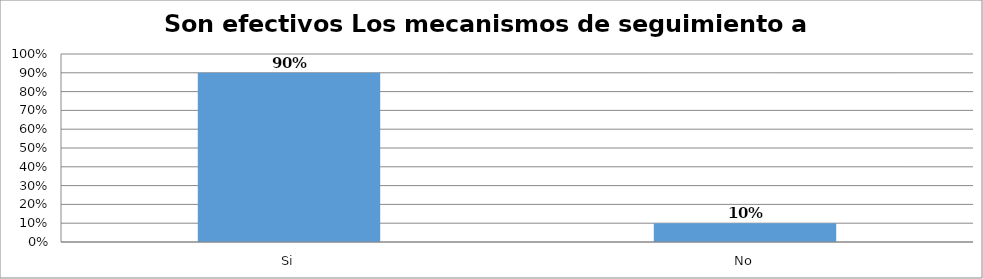
| Category | Series 0 |
|---|---|
| Si | 0.9 |
| No | 0.1 |